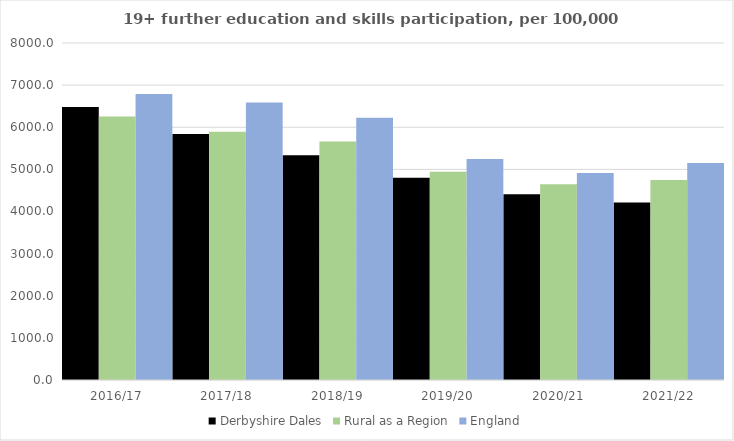
| Category | Derbyshire Dales | Rural as a Region | England |
|---|---|---|---|
| 2016/17 | 6481 | 6253.401 | 6788 |
| 2017/18 | 5842 | 5892.029 | 6588 |
| 2018/19 | 5338 | 5661.873 | 6227 |
| 2019/20 | 4802 | 4943.801 | 5244 |
| 2020/21 | 4407 | 4646.727 | 4913 |
| 2021/22 | 4215 | 4747.049 | 5151 |